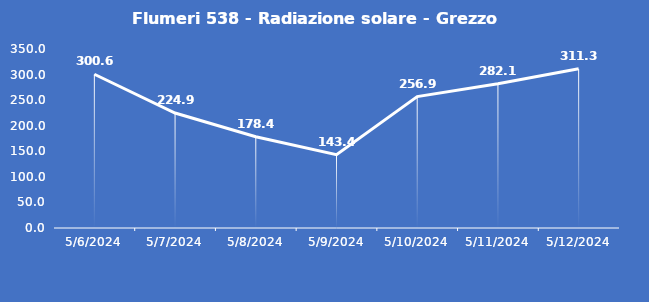
| Category | Flumeri 538 - Radiazione solare - Grezzo (W/m2) |
|---|---|
| 5/6/24 | 300.6 |
| 5/7/24 | 224.9 |
| 5/8/24 | 178.4 |
| 5/9/24 | 143.4 |
| 5/10/24 | 256.9 |
| 5/11/24 | 282.1 |
| 5/12/24 | 311.3 |